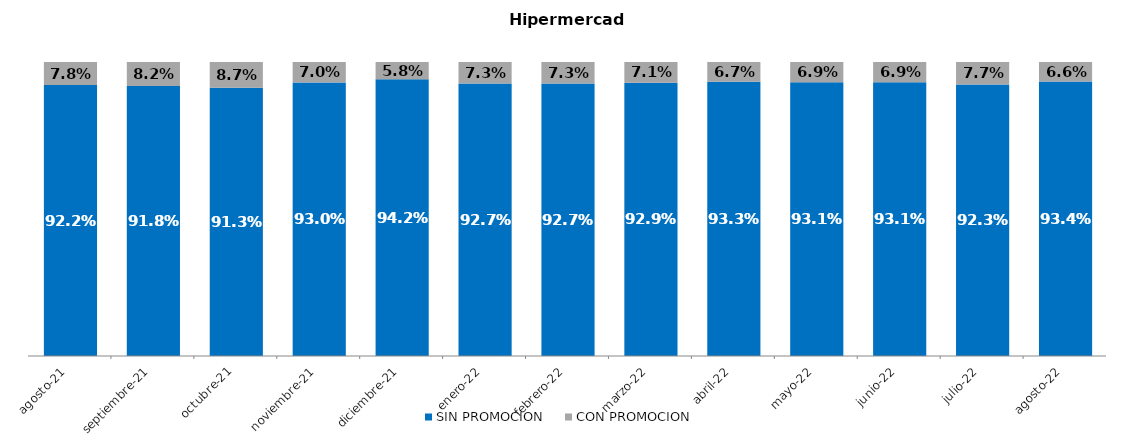
| Category | SIN PROMOCION   | CON PROMOCION   |
|---|---|---|
| 2021-08-01 | 0.922 | 0.078 |
| 2021-09-01 | 0.918 | 0.082 |
| 2021-10-01 | 0.913 | 0.087 |
| 2021-11-01 | 0.93 | 0.07 |
| 2021-12-01 | 0.942 | 0.058 |
| 2022-01-01 | 0.927 | 0.073 |
| 2022-02-01 | 0.927 | 0.073 |
| 2022-03-01 | 0.929 | 0.071 |
| 2022-04-01 | 0.933 | 0.067 |
| 2022-05-01 | 0.931 | 0.069 |
| 2022-06-01 | 0.931 | 0.069 |
| 2022-07-01 | 0.923 | 0.077 |
| 2022-08-01 | 0.934 | 0.066 |